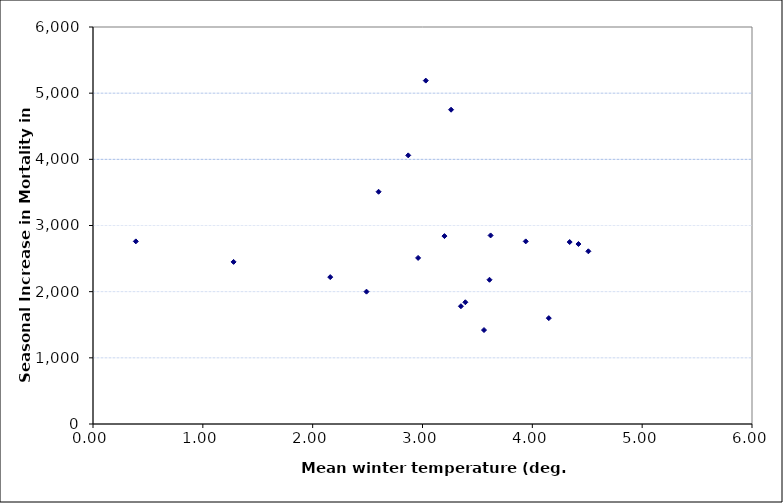
| Category | Seas Incr. Mort. |
|---|---|
| 4.51 | 2610 |
| 3.26 | 4750 |
| 3.03 | 5190 |
| 2.16 | 2220 |
| 3.39 | 1840 |
| 2.96 | 2510 |
| 3.2 | 2840 |
| 3.94 | 2760 |
| 3.35 | 1780 |
| 4.34 | 2750 |
| 3.61 | 2180 |
| 2.6 | 3510 |
| 0.39 | 2760 |
| 1.28 | 2450 |
| 3.56 | 1420 |
| 2.49 | 2000 |
| 4.15 | 1600 |
| 2.87 | 4060 |
| 3.62 | 2850 |
| 4.42 | 2720 |